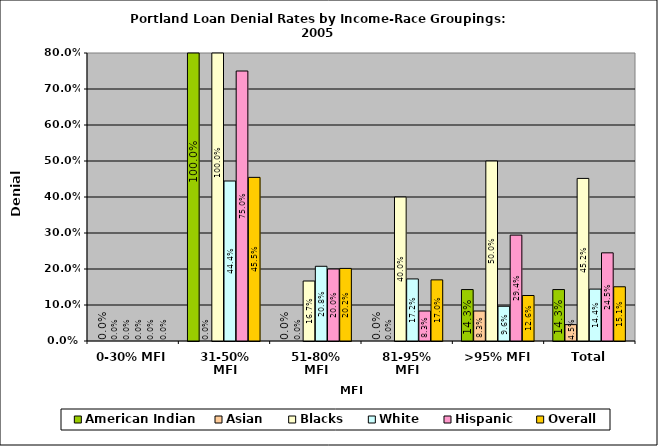
| Category | American Indian | Asian | Blacks | White | Hispanic | Overall |
|---|---|---|---|---|---|---|
| 0-30% MFI | 0 | 0 | 0 | 0 | 0 | 0 |
| 31-50% MFI | 1 | 0 | 1 | 0.444 | 0.75 | 0.455 |
| 51-80% MFI | 0 | 0 | 0.167 | 0.208 | 0.2 | 0.202 |
| 81-95% MFI | 0 | 0 | 0.4 | 0.172 | 0.083 | 0.17 |
| >95% MFI | 0.143 | 0.083 | 0.5 | 0.096 | 0.294 | 0.126 |
| Total | 0.143 | 0.045 | 0.452 | 0.144 | 0.245 | 0.151 |